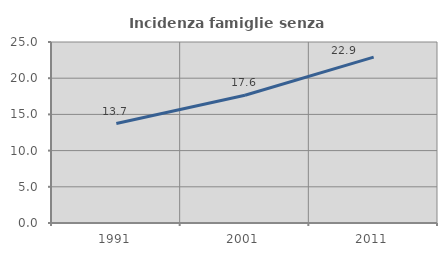
| Category | Incidenza famiglie senza nuclei |
|---|---|
| 1991.0 | 13.739 |
| 2001.0 | 17.637 |
| 2011.0 | 22.903 |